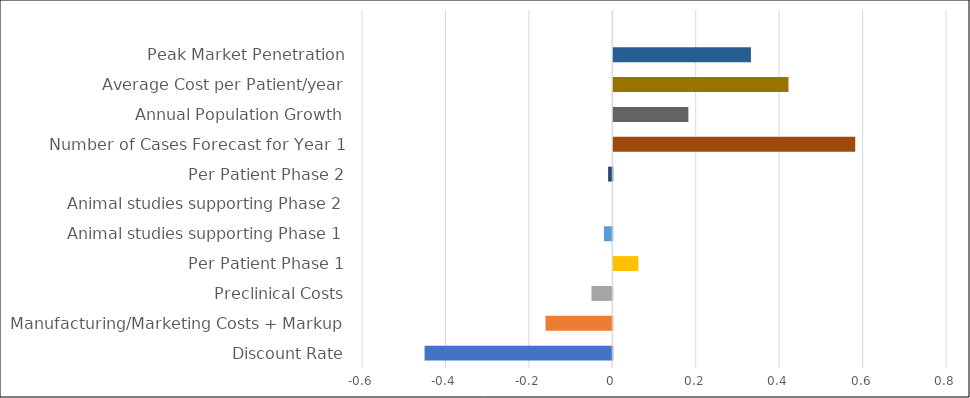
| Category | Correlation w/ NPV |
|---|---|
| Discount Rate | -0.45 |
| Manufacturing/Marketing Costs + Markup | -0.16 |
| Preclinical Costs | -0.05 |
| Per Patient Phase 1 | 0.06 |
| Animal studies supporting Phase 1 | -0.02 |
| Animal studies supporting Phase 2 | 0 |
| Per Patient Phase 2 | -0.01 |
| Number of Cases Forecast for Year 1 | 0.58 |
| Annual Population Growth | 0.18 |
| Average Cost per Patient/year | 0.42 |
| Peak Market Penetration | 0.33 |